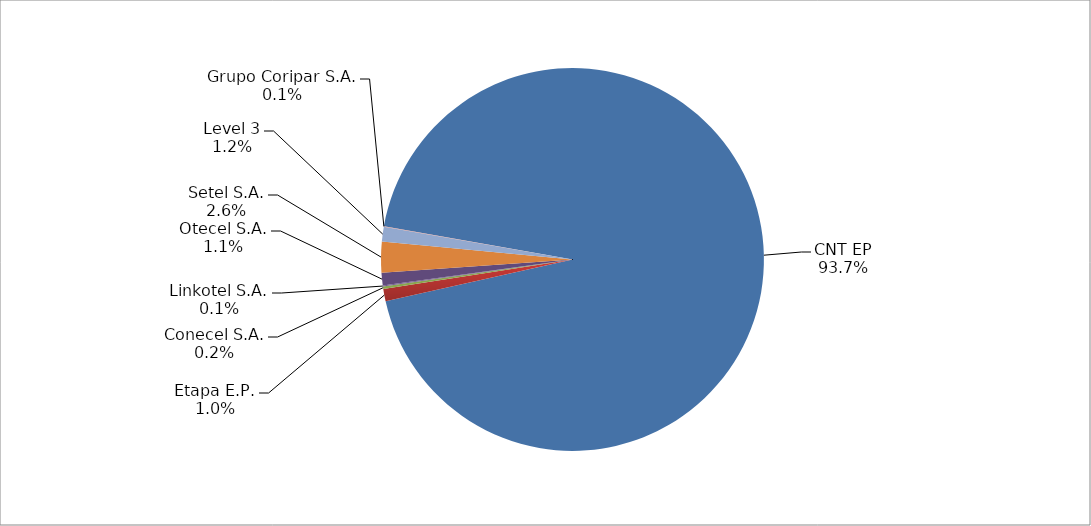
| Category | Series 0 |
|---|---|
| CNT EP | 2347 |
| Etapa E.P. | 26 |
| Conecel S.A. | 5 |
| Linkotel S.A. | 2 |
| Otecel S.A. | 27 |
| Setel S.A. | 65 |
| Level 3 | 31 |
| Grupo Coripar S.A. | 1 |